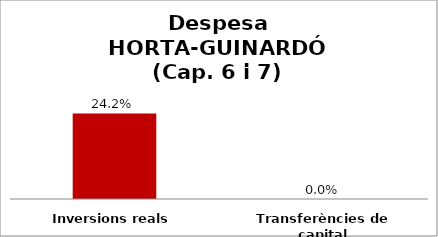
| Category | Series 0 |
|---|---|
| Inversions reals | 0.242 |
| Transferències de capital | 0 |